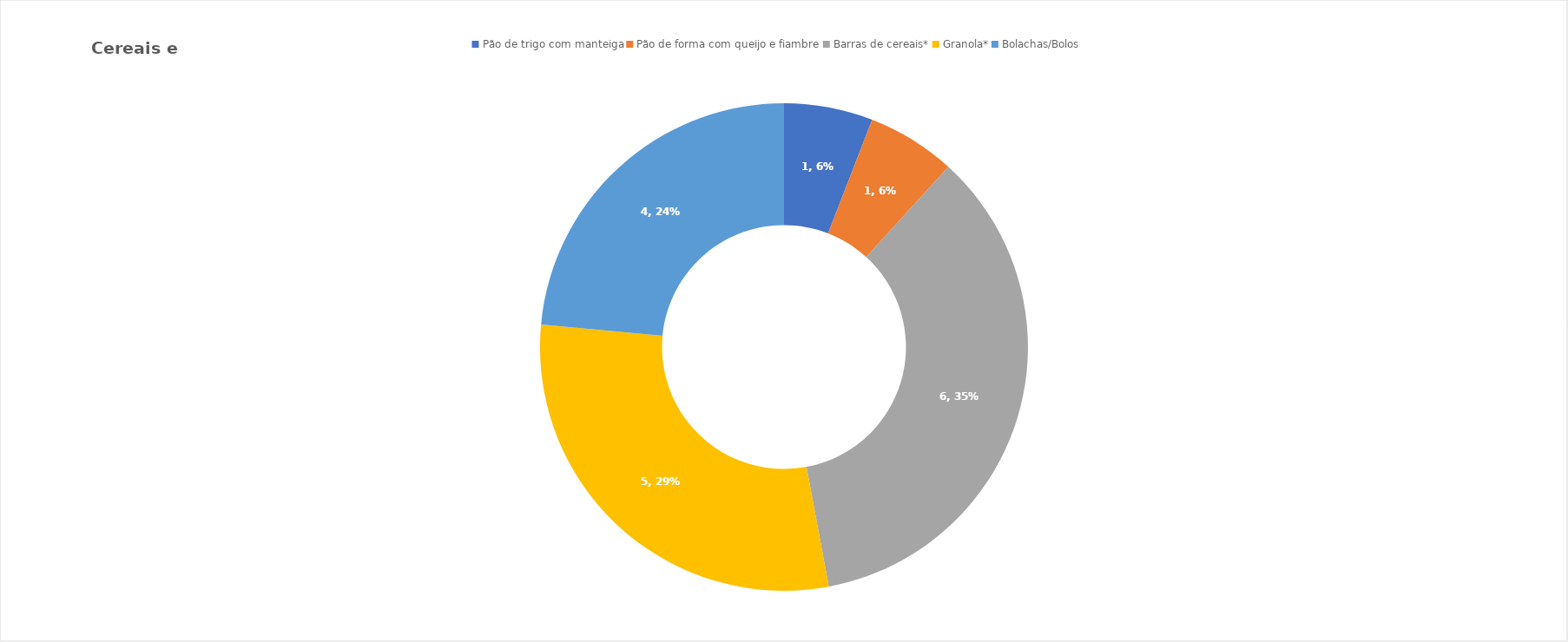
| Category | Series 0 |
|---|---|
| Pão de trigo com manteiga | 1 |
| Pão de forma com queijo e fiambre | 1 |
| Barras de cereais* | 6 |
| Granola* | 5 |
| Bolachas/Bolos | 4 |